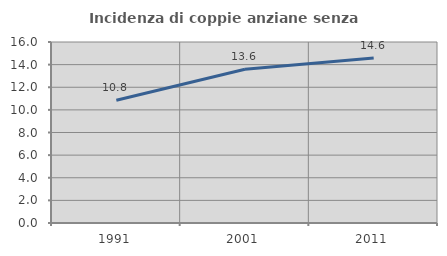
| Category | Incidenza di coppie anziane senza figli  |
|---|---|
| 1991.0 | 10.846 |
| 2001.0 | 13.59 |
| 2011.0 | 14.592 |